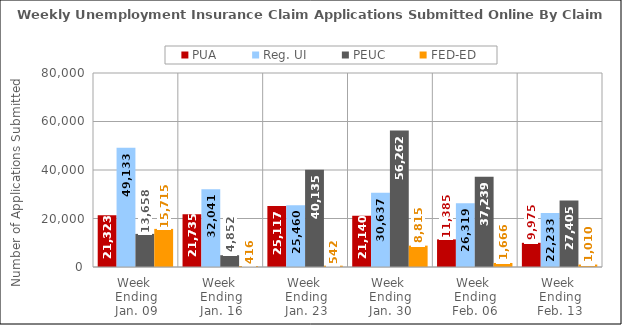
| Category | PUA | Reg. UI | PEUC | FED-ED |
|---|---|---|---|---|
| Week 
Ending
Jan. 09 | 21323 | 49133 | 13658 | 15715 |
| Week 
Ending
Jan. 16 | 21735 | 32041 | 4852 | 416 |
| Week 
Ending
Jan. 23 | 25117 | 25460 | 40135 | 542 |
| Week 
Ending
Jan. 30 | 21140 | 30637 | 56262 | 8815 |
| Week 
Ending
Feb. 06 | 11385 | 26319 | 37239 | 1666 |
| Week 
Ending
Feb. 13 | 9975 | 22233 | 27405 | 1010 |